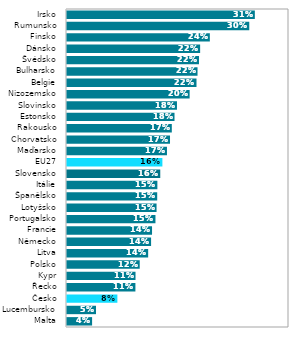
| Category | Series 0 |
|---|---|
| Malta | 0.042 |
| Lucembursko | 0.048 |
| Česko | 0.084 |
| Řecko | 0.114 |
| Kypr | 0.114 |
| Polsko | 0.121 |
| Litva | 0.135 |
| Německo | 0.14 |
| Francie | 0.142 |
| Portugalsko | 0.147 |
| Lotyšsko | 0.149 |
| Španělsko | 0.15 |
| Itálie | 0.151 |
| Slovensko | 0.155 |
| EU27 | 0.159 |
| Maďarsko | 0.167 |
| Chorvatsko | 0.172 |
| Rakousko | 0.175 |
| Estonsko | 0.179 |
| Slovinsko | 0.183 |
| Nizozemsko | 0.204 |
| Belgie | 0.216 |
| Bulharsko | 0.218 |
| Švédsko | 0.22 |
| Dánsko | 0.222 |
| Finsko | 0.238 |
| Rumunsko | 0.304 |
| Irsko | 0.313 |